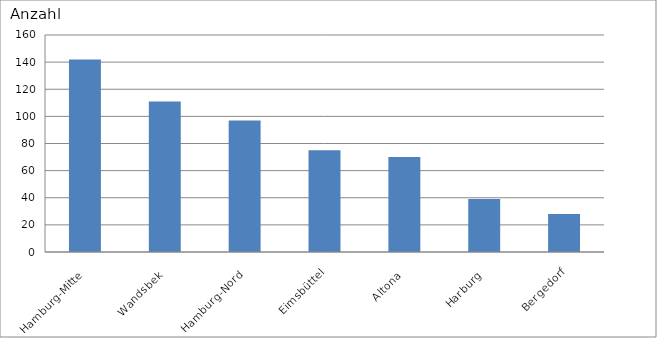
| Category | Hamburg-Mitte Wandsbek Hamburg-Nord Eimsbüttel Altona Harburg Bergedorf |
|---|---|
| Hamburg-Mitte | 142 |
| Wandsbek | 111 |
| Hamburg-Nord | 97 |
| Eimsbüttel | 75 |
| Altona | 70 |
| Harburg | 39 |
| Bergedorf | 28 |